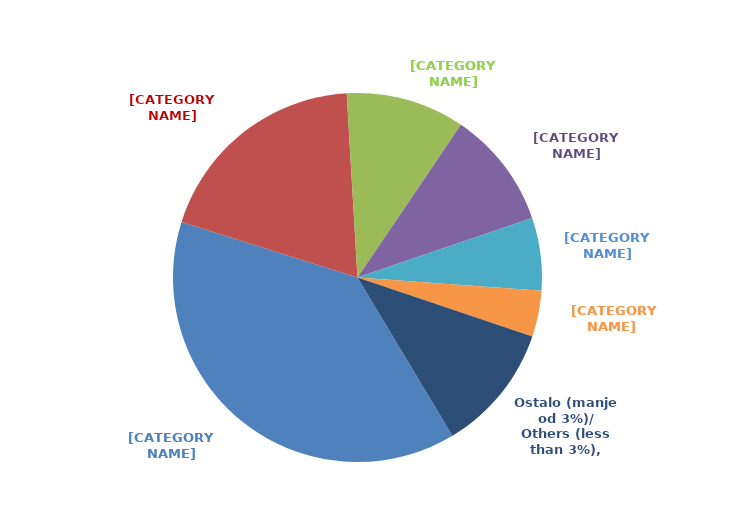
| Category | Series 0 |
|---|---|
| 10 | 0.385 |
| 20 | 0.192 |
| 1 | 0.104 |
| 9 | 0.103 |
| 3 | 0.064 |
| 8 | 0.04 |
| Ostalo (manje od 3%)/
Others (less than 3%) | 0.112 |